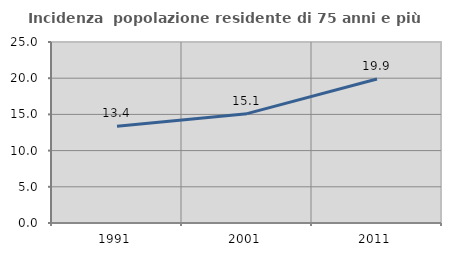
| Category | Incidenza  popolazione residente di 75 anni e più |
|---|---|
| 1991.0 | 13.366 |
| 2001.0 | 15.104 |
| 2011.0 | 19.895 |